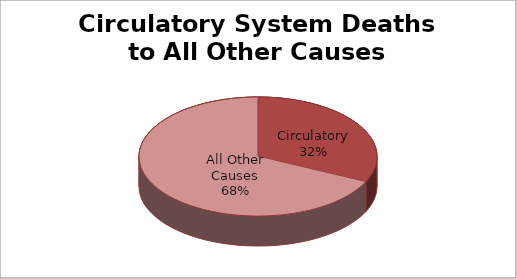
| Category | Series 0 |
|---|---|
| Circulatory | 8 |
| All Other Causes | 17 |